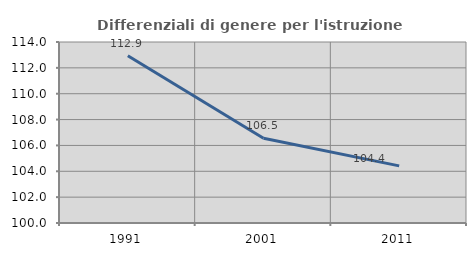
| Category | Differenziali di genere per l'istruzione superiore |
|---|---|
| 1991.0 | 112.939 |
| 2001.0 | 106.55 |
| 2011.0 | 104.417 |